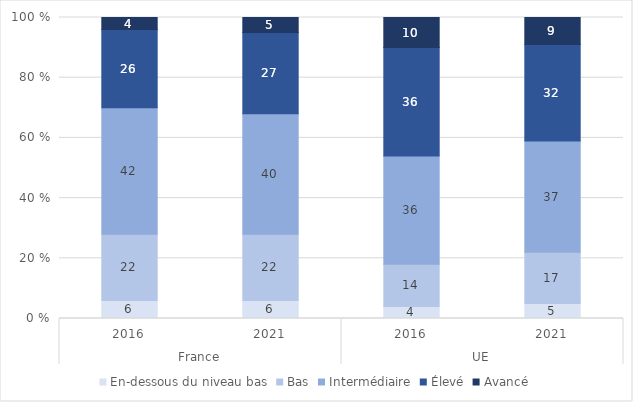
| Category | En-dessous du niveau bas | Bas | Intermédiaire | Élevé | Avancé |
|---|---|---|---|---|---|
| 0 | 6 | 22 | 42 | 26 | 4 |
| 1 | 6 | 22 | 40 | 27 | 5 |
| 2 | 4 | 14 | 36 | 36 | 10 |
| 3 | 5 | 17 | 37 | 32 | 9 |